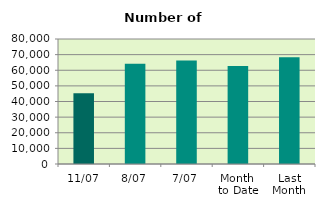
| Category | Series 0 |
|---|---|
| 11/07 | 45232 |
| 8/07 | 64230 |
| 7/07 | 66196 |
| Month 
to Date | 62754.857 |
| Last
Month | 68392.182 |